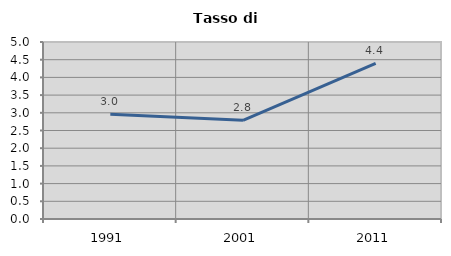
| Category | Tasso di disoccupazione   |
|---|---|
| 1991.0 | 2.956 |
| 2001.0 | 2.789 |
| 2011.0 | 4.396 |